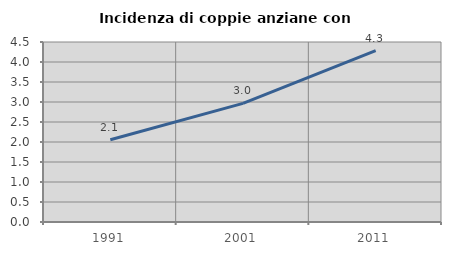
| Category | Incidenza di coppie anziane con figli |
|---|---|
| 1991.0 | 2.058 |
| 2001.0 | 2.966 |
| 2011.0 | 4.286 |